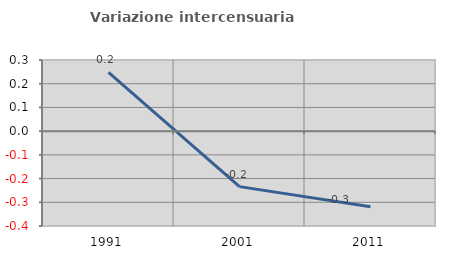
| Category | Variazione intercensuaria annua |
|---|---|
| 1991.0 | 0.247 |
| 2001.0 | -0.234 |
| 2011.0 | -0.318 |